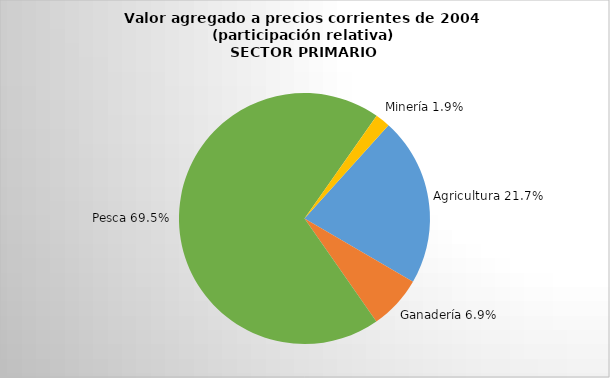
| Category | Series 0 |
|---|---|
| Agricultura | 128.659 |
| Ganadería | 40.95 |
| Pesca | 411.307 |
| Minería | 11.349 |